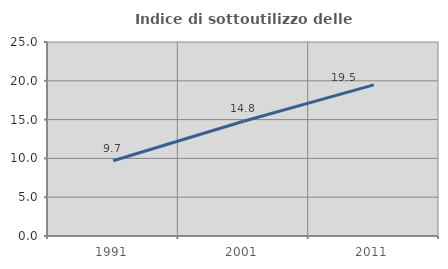
| Category | Indice di sottoutilizzo delle abitazioni  |
|---|---|
| 1991.0 | 9.696 |
| 2001.0 | 14.795 |
| 2011.0 | 19.473 |